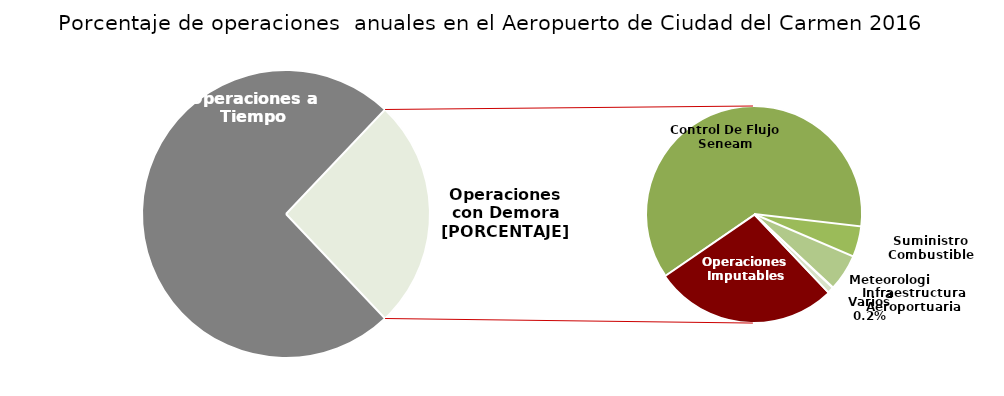
| Category | Series 0 |
|---|---|
| Operaciones a Tiempo | 4601 |
| Operaciones Imputables | 441 |
| Control De Flujo Seneam | 985 |
| Suministro Combustible | 74 |
| Meteorologia | 88 |
| Infraestructura Aeroportuaria | 1 |
| Varios | 15 |